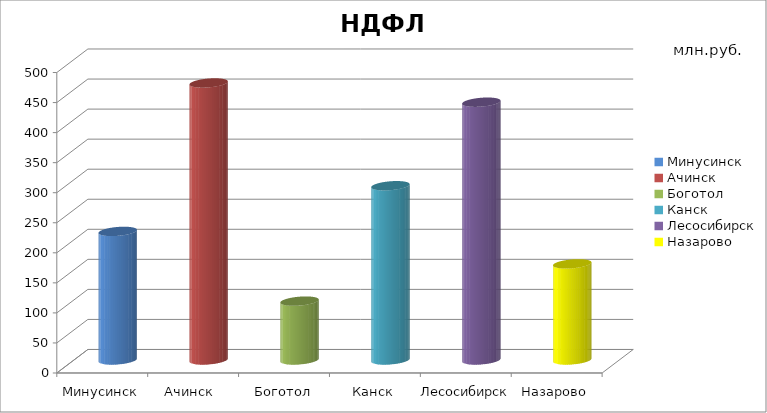
| Category | НДФЛ |
|---|---|
| Минусинск | 214 |
| Ачинск  | 461 |
| Боготол | 98 |
| Канск | 290 |
| Лесосибирск | 429 |
| Назарово | 160 |